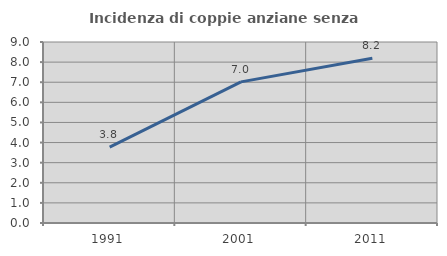
| Category | Incidenza di coppie anziane senza figli  |
|---|---|
| 1991.0 | 3.774 |
| 2001.0 | 7.018 |
| 2011.0 | 8.197 |